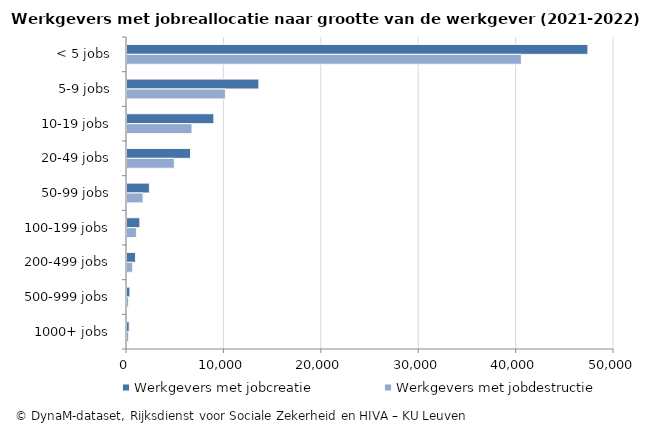
| Category | Werkgevers met jobcreatie | Werkgevers met jobdestructie |
|---|---|---|
| < 5 jobs | 47321 | 40487 |
| 5-9 jobs | 13541 | 10103 |
| 10-19 jobs | 8919 | 6674 |
| 20-49 jobs | 6521 | 4853 |
| 50-99 jobs | 2299 | 1648 |
| 100-199 jobs | 1320 | 967 |
| 200-499 jobs | 879 | 581 |
| 500-999 jobs | 299 | 163 |
| 1000+ jobs | 225 | 170 |